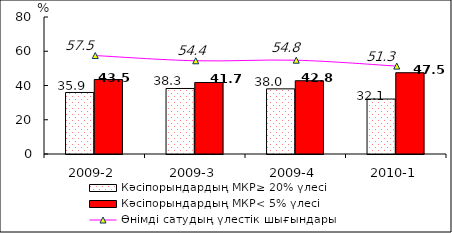
| Category | Кәсіпорындардың МКР≥ 20% үлесі | Кәсіпорындардың МКР< 5% үлесі |
|---|---|---|
| 2009-2 | 35.93 | 43.47 |
| 2009-3 | 38.26 | 41.74 |
| 2009-4 | 38.04 | 42.78 |
| 2010-1 | 32.09 | 47.46 |